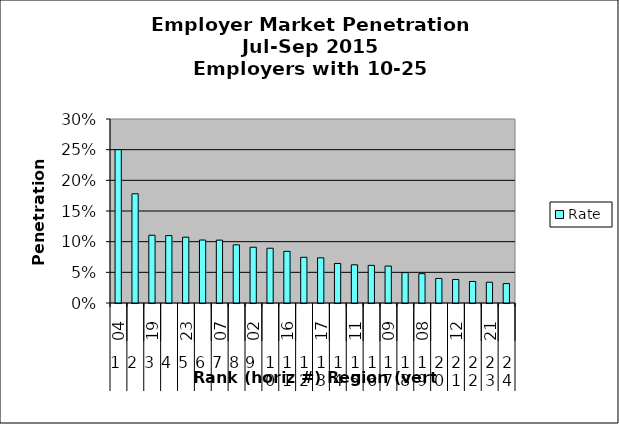
| Category | Rate |
|---|---|
| 0 | 0.25 |
| 1 | 0.178 |
| 2 | 0.11 |
| 3 | 0.11 |
| 4 | 0.107 |
| 5 | 0.103 |
| 6 | 0.102 |
| 7 | 0.095 |
| 8 | 0.091 |
| 9 | 0.089 |
| 10 | 0.084 |
| 11 | 0.075 |
| 12 | 0.074 |
| 13 | 0.064 |
| 14 | 0.062 |
| 15 | 0.061 |
| 16 | 0.06 |
| 17 | 0.05 |
| 18 | 0.048 |
| 19 | 0.04 |
| 20 | 0.038 |
| 21 | 0.035 |
| 22 | 0.034 |
| 23 | 0.032 |